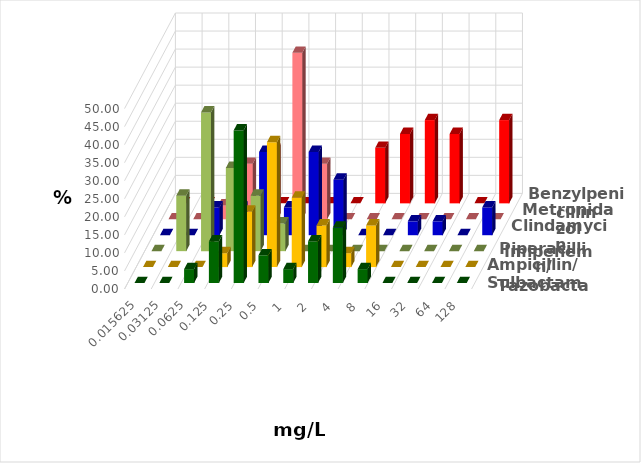
| Category | Ampicillin/ Sulbactam | Piperacillin/ Tazobactam | Imipenem | Clindamycin | Metronidazol | Benzylpenicillin |
|---|---|---|---|---|---|---|
| 0.015625 | 0 | 0 | 0 | 0 | 0 | 0 |
| 0.03125 | 0 | 0 | 15.385 | 0 | 0 | 0 |
| 0.0625 | 3.846 | 0 | 38.462 | 7.692 | 3.846 | 0 |
| 0.125 | 11.538 | 3.846 | 23.077 | 7.692 | 15.385 | 0 |
| 0.25 | 42.308 | 15.385 | 15.385 | 23.077 | 19.231 | 0 |
| 0.5 | 7.692 | 34.615 | 7.692 | 7.692 | 46.154 | 0 |
| 1.0 | 3.846 | 19.231 | 0 | 23.077 | 15.385 | 0 |
| 2.0 | 11.538 | 11.538 | 0 | 15.385 | 0 | 0 |
| 4.0 | 15.385 | 3.846 | 0 | 0 | 0 | 15.385 |
| 8.0 | 3.846 | 11.538 | 0 | 0 | 0 | 19.231 |
| 16.0 | 0 | 0 | 0 | 3.846 | 0 | 23.077 |
| 32.0 | 0 | 0 | 0 | 3.846 | 0 | 19.231 |
| 64.0 | 0 | 0 | 0 | 0 | 0 | 0 |
| 128.0 | 0 | 0 | 0 | 7.692 | 0 | 23.077 |